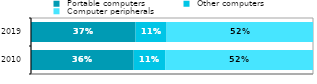
| Category |  Portable computers |  Other computers |  Computer peripherals |
|---|---|---|---|
| 2010.0 | 0.364 | 0.112 | 0.524 |
| 2019.0 | 0.371 | 0.11 | 0.519 |